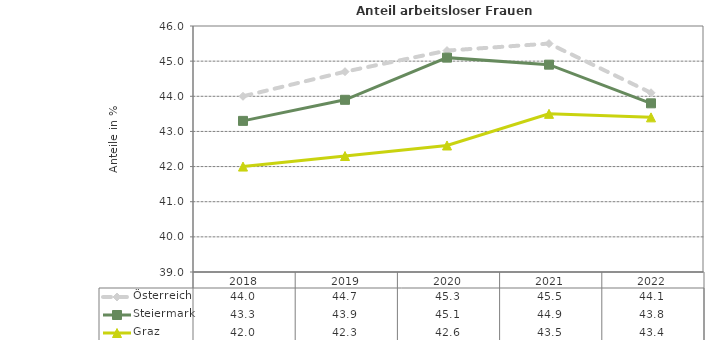
| Category | Österreich | Steiermark | Graz |
|---|---|---|---|
| 2022.0 | 44.1 | 43.8 | 43.4 |
| 2021.0 | 45.5 | 44.9 | 43.5 |
| 2020.0 | 45.3 | 45.1 | 42.6 |
| 2019.0 | 44.7 | 43.9 | 42.3 |
| 2018.0 | 44 | 43.3 | 42 |